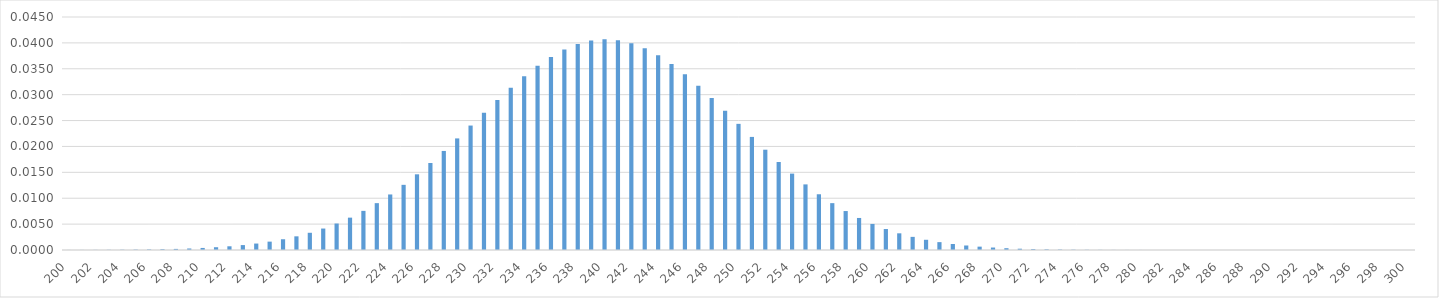
| Category | Series 0 |
|---|---|
| 200.0 | 0 |
| 201.0 | 0 |
| 202.0 | 0 |
| 203.0 | 0 |
| 204.0 | 0 |
| 205.0 | 0 |
| 206.0 | 0 |
| 207.0 | 0 |
| 208.0 | 0 |
| 209.0 | 0 |
| 210.0 | 0 |
| 211.0 | 0.001 |
| 212.0 | 0.001 |
| 213.0 | 0.001 |
| 214.0 | 0.001 |
| 215.0 | 0.002 |
| 216.0 | 0.002 |
| 217.0 | 0.003 |
| 218.0 | 0.003 |
| 219.0 | 0.004 |
| 220.0 | 0.005 |
| 221.0 | 0.006 |
| 222.0 | 0.008 |
| 223.0 | 0.009 |
| 224.0 | 0.011 |
| 225.0 | 0.013 |
| 226.0 | 0.015 |
| 227.0 | 0.017 |
| 228.0 | 0.019 |
| 229.0 | 0.022 |
| 230.0 | 0.024 |
| 231.0 | 0.027 |
| 232.0 | 0.029 |
| 233.0 | 0.031 |
| 234.0 | 0.034 |
| 235.0 | 0.036 |
| 236.0 | 0.037 |
| 237.0 | 0.039 |
| 238.0 | 0.04 |
| 239.0 | 0.04 |
| 240.0 | 0.041 |
| 241.0 | 0.041 |
| 242.0 | 0.04 |
| 243.0 | 0.039 |
| 244.0 | 0.038 |
| 245.0 | 0.036 |
| 246.0 | 0.034 |
| 247.0 | 0.032 |
| 248.0 | 0.029 |
| 249.0 | 0.027 |
| 250.0 | 0.024 |
| 251.0 | 0.022 |
| 252.0 | 0.019 |
| 253.0 | 0.017 |
| 254.0 | 0.015 |
| 255.0 | 0.013 |
| 256.0 | 0.011 |
| 257.0 | 0.009 |
| 258.0 | 0.008 |
| 259.0 | 0.006 |
| 260.0 | 0.005 |
| 261.0 | 0.004 |
| 262.0 | 0.003 |
| 263.0 | 0.003 |
| 264.0 | 0.002 |
| 265.0 | 0.002 |
| 266.0 | 0.001 |
| 267.0 | 0.001 |
| 268.0 | 0.001 |
| 269.0 | 0 |
| 270.0 | 0 |
| 271.0 | 0 |
| 272.0 | 0 |
| 273.0 | 0 |
| 274.0 | 0 |
| 275.0 | 0 |
| 276.0 | 0 |
| 277.0 | 0 |
| 278.0 | 0 |
| 279.0 | 0 |
| 280.0 | 0 |
| 281.0 | 0 |
| 282.0 | 0 |
| 283.0 | 0 |
| 284.0 | 0 |
| 285.0 | 0 |
| 286.0 | 0 |
| 287.0 | 0 |
| 288.0 | 0 |
| 289.0 | 0 |
| 290.0 | 0 |
| 291.0 | 0 |
| 292.0 | 0 |
| 293.0 | 0 |
| 294.0 | 0 |
| 295.0 | 0 |
| 296.0 | 0 |
| 297.0 | 0 |
| 298.0 | 0 |
| 299.0 | 0 |
| 300.0 | 0 |